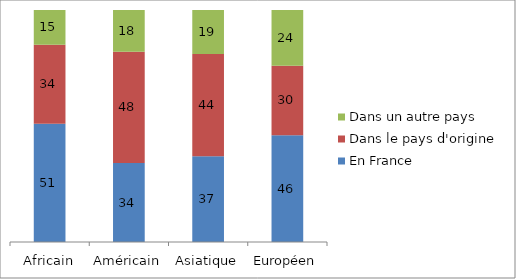
| Category | En France | Dans le pays d'origine | Dans un autre pays |
|---|---|---|---|
| Africain | 51 | 34 | 15 |
| Américain | 34 | 48 | 18 |
| Asiatique | 37 | 44 | 19 |
| Européen | 46 | 30 | 24 |